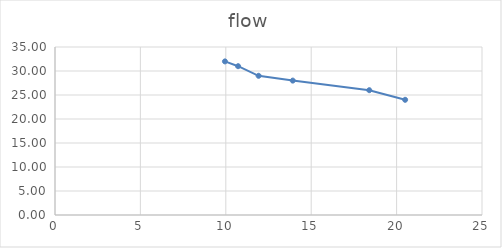
| Category | flow |
|---|---|
| 9.95 | 32 |
| 10.72 | 31 |
| 11.92 | 29 |
| 13.92 | 28 |
| 18.4 | 26 |
| 20.499999999999996 | 24 |